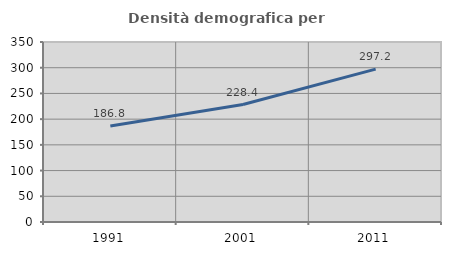
| Category | Densità demografica |
|---|---|
| 1991.0 | 186.844 |
| 2001.0 | 228.363 |
| 2011.0 | 297.187 |